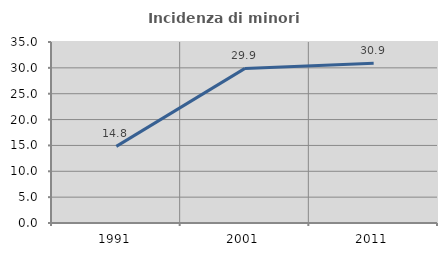
| Category | Incidenza di minori stranieri |
|---|---|
| 1991.0 | 14.815 |
| 2001.0 | 29.897 |
| 2011.0 | 30.897 |